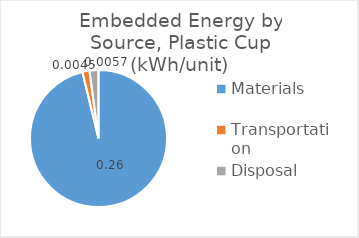
| Category | Series 0 |
|---|---|
| Materials | 0.26 |
| Transportation | 0.005 |
| Disposal | 0.006 |